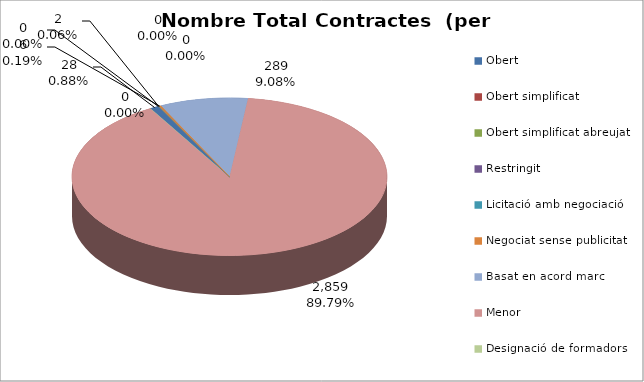
| Category | Nombre Total Contractes |
|---|---|
| Obert | 28 |
| Obert simplificat | 0 |
| Obert simplificat abreujat | 2 |
| Restringit | 0 |
| Licitació amb negociació | 0 |
| Negociat sense publicitat | 6 |
| Basat en acord marc | 289 |
| Menor | 2859 |
| Designació de formadors | 0 |